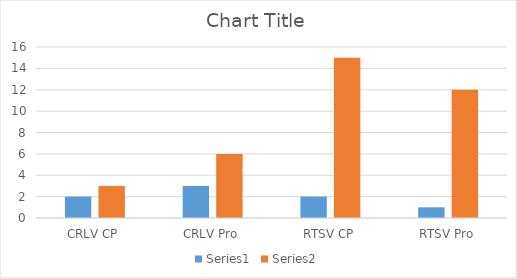
| Category | Series 0 | Series 1 |
|---|---|---|
| CRLV CP | 2 | 3 |
| CRLV Pro | 3 | 6 |
| RTSV CP | 2 | 15 |
| RTSV Pro | 1 | 12 |